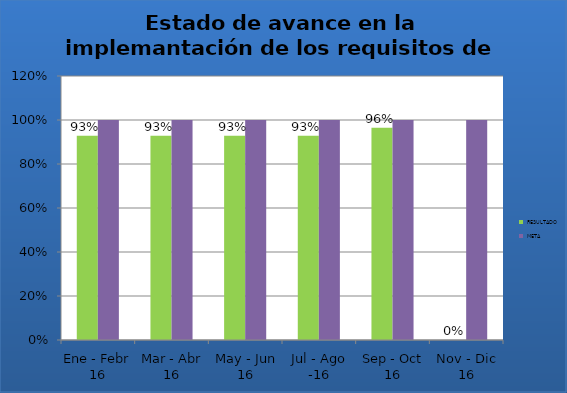
| Category | RESULTADO | META |
|---|---|---|
| Ene - Febr 16 | 0.929 | 1 |
| Mar - Abr 16 | 0.929 | 1 |
| May - Jun 16 | 0.929 | 1 |
| Jul - Ago -16 | 0.929 | 1 |
| Sep - Oct 16 | 0.964 | 1 |
| Nov - Dic 16 | 0 | 1 |